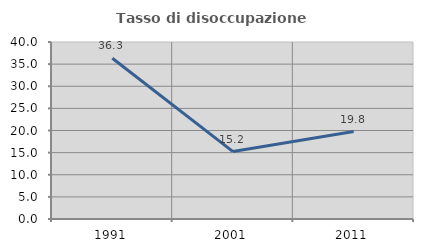
| Category | Tasso di disoccupazione giovanile  |
|---|---|
| 1991.0 | 36.325 |
| 2001.0 | 15.238 |
| 2011.0 | 19.767 |